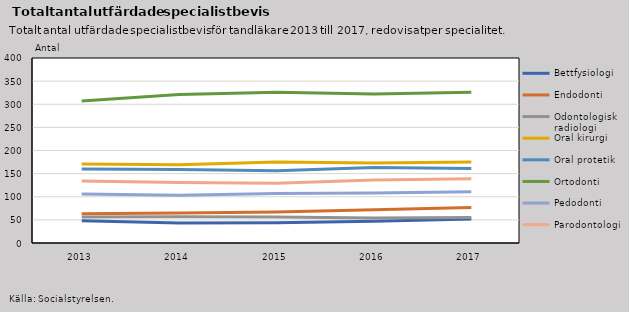
| Category | Bettfysiologi | Endodonti | Odontologisk radiologi | Oral kirurgi | Oral protetik | Ortodonti | Pedodonti | Parodontologi |
|---|---|---|---|---|---|---|---|---|
| 2013.0 | 48 | 63 | 56 | 171 | 160 | 307 | 106 | 134 |
| 2014.0 | 43 | 65 | 57 | 169 | 159 | 321 | 103 | 131 |
| 2015.0 | 44 | 67 | 56 | 175 | 156 | 326 | 107 | 129 |
| 2016.0 | 47 | 72 | 54 | 173 | 163 | 322 | 108 | 136 |
| 2017.0 | 52 | 77 | 55 | 175 | 161 | 326 | 111 | 139 |